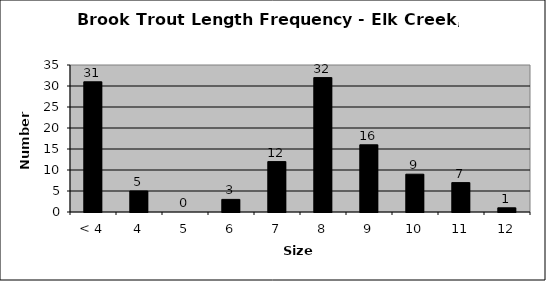
| Category | Series 0 |
|---|---|
| < 4 | 31 |
| 4 | 5 |
| 5 | 0 |
| 6 | 3 |
| 7 | 12 |
| 8 | 32 |
| 9 | 16 |
| 10 | 9 |
| 11 | 7 |
| 12 | 1 |